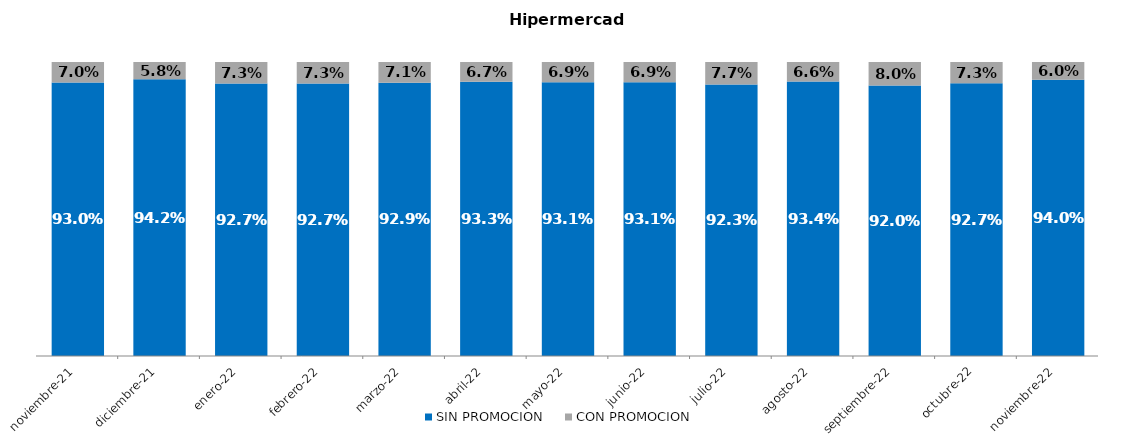
| Category | SIN PROMOCION   | CON PROMOCION   |
|---|---|---|
| 2021-11-01 | 0.93 | 0.07 |
| 2021-12-01 | 0.942 | 0.058 |
| 2022-01-01 | 0.927 | 0.073 |
| 2022-02-01 | 0.927 | 0.073 |
| 2022-03-01 | 0.929 | 0.071 |
| 2022-04-01 | 0.933 | 0.067 |
| 2022-05-01 | 0.931 | 0.069 |
| 2022-06-01 | 0.931 | 0.069 |
| 2022-07-01 | 0.923 | 0.077 |
| 2022-08-01 | 0.934 | 0.066 |
| 2022-09-01 | 0.92 | 0.08 |
| 2022-10-01 | 0.927 | 0.073 |
| 2022-11-01 | 0.94 | 0.06 |